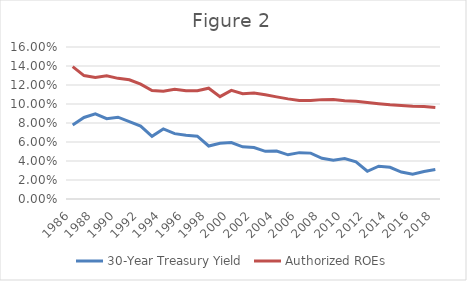
| Category | 30-Year Treasury Yield | Authorized ROEs |
|---|---|---|
| 1986.0 | 0.078 | 0.139 |
| 1987.0 | 0.086 | 0.13 |
| 1988.0 | 0.09 | 0.128 |
| 1989.0 | 0.084 | 0.13 |
| 1990.0 | 0.086 | 0.127 |
| 1991.0 | 0.081 | 0.126 |
| 1992.0 | 0.077 | 0.121 |
| 1993.0 | 0.066 | 0.114 |
| 1994.0 | 0.074 | 0.113 |
| 1995.0 | 0.069 | 0.116 |
| 1996.0 | 0.067 | 0.114 |
| 1997.0 | 0.066 | 0.114 |
| 1998.0 | 0.056 | 0.117 |
| 1999.0 | 0.059 | 0.108 |
| 2000.0 | 0.059 | 0.114 |
| 2001.0 | 0.055 | 0.111 |
| 2002.0 | 0.054 | 0.112 |
| 2003.0 | 0.05 | 0.11 |
| 2004.0 | 0.05 | 0.108 |
| 2005.0 | 0.046 | 0.105 |
| 2006.0 | 0.049 | 0.104 |
| 2007.0 | 0.048 | 0.104 |
| 2008.0 | 0.043 | 0.105 |
| 2009.0 | 0.041 | 0.105 |
| 2010.0 | 0.042 | 0.103 |
| 2011.0 | 0.039 | 0.103 |
| 2012.0 | 0.029 | 0.102 |
| 2013.0 | 0.034 | 0.1 |
| 2014.0 | 0.033 | 0.099 |
| 2015.0 | 0.028 | 0.098 |
| 2016.0 | 0.026 | 0.098 |
| 2017.0 | 0.029 | 0.097 |
| 2018.0 | 0.031 | 0.096 |